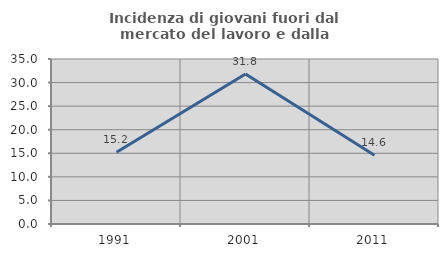
| Category | Incidenza di giovani fuori dal mercato del lavoro e dalla formazione  |
|---|---|
| 1991.0 | 15.221 |
| 2001.0 | 31.829 |
| 2011.0 | 14.562 |